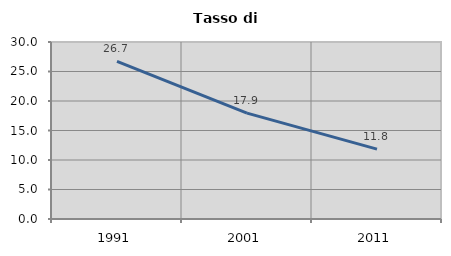
| Category | Tasso di disoccupazione   |
|---|---|
| 1991.0 | 26.705 |
| 2001.0 | 17.946 |
| 2011.0 | 11.844 |